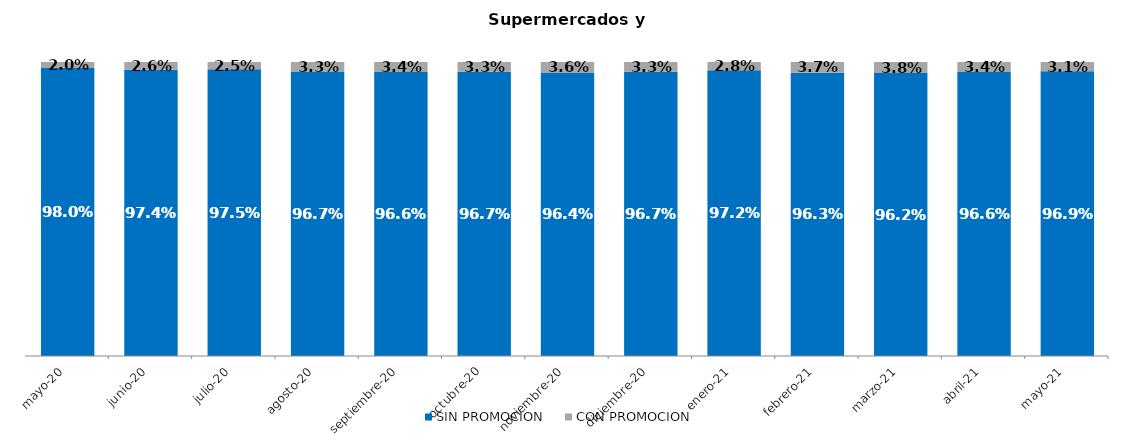
| Category | SIN PROMOCION   | CON PROMOCION   |
|---|---|---|
| 2020-05-01 | 0.98 | 0.02 |
| 2020-06-01 | 0.974 | 0.026 |
| 2020-07-01 | 0.975 | 0.025 |
| 2020-08-01 | 0.967 | 0.033 |
| 2020-09-01 | 0.966 | 0.034 |
| 2020-10-01 | 0.967 | 0.033 |
| 2020-11-01 | 0.964 | 0.036 |
| 2020-12-01 | 0.967 | 0.033 |
| 2021-01-01 | 0.972 | 0.028 |
| 2021-02-01 | 0.963 | 0.037 |
| 2021-03-01 | 0.962 | 0.038 |
| 2021-04-01 | 0.966 | 0.034 |
| 2021-05-01 | 0.969 | 0.031 |